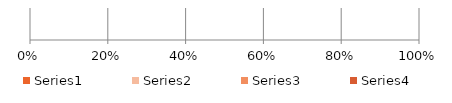
| Category | Series 0 | Series 1 | Series 2 | Series 3 |
|---|---|---|---|---|
| 0 | 3672.193 | 2295.995 | 677.076 | 112.407 |